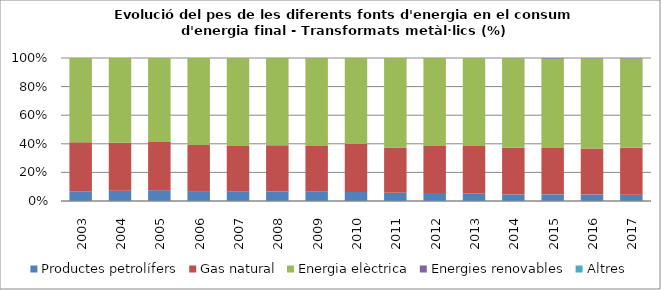
| Category | Productes petrolífers | Gas natural | Energia elèctrica | Energies renovables | Altres |
|---|---|---|---|---|---|
| 2003.0 | 27.7 | 139.5 | 239.2 | 0 | 0 |
| 2004.0 | 29.8 | 138.4 | 244.9 | 0.1 | 0 |
| 2005.0 | 31.3 | 139.2 | 243 | 0.1 | 0 |
| 2006.0 | 27.6 | 129.2 | 243.6 | 0.1 | 0 |
| 2007.0 | 26.7 | 124 | 240.8 | 0.1 | 0 |
| 2008.0 | 24.9 | 121 | 228.7 | 0.2 | 0 |
| 2009.0 | 20.3 | 95.6 | 185.6 | 0.2 | 0 |
| 2010.0 | 20.3 | 106.6 | 191.7 | 0.2 | 0 |
| 2011.0 | 17.7 | 99 | 194.7 | 0.1 | 0 |
| 2012.0 | 16.9 | 99.4 | 185.8 | 0.2 | 0 |
| 2013.0 | 15.7 | 99.1 | 183.3 | 0.3 | 0 |
| 2014.0 | 13.7 | 95.6 | 184.5 | 0.4 | 0 |
| 2015.0 | 14 | 97.9 | 188.6 | 1.1 | 0 |
| 2016.0 | 13.4 | 96 | 188.2 | 0.8 | 0 |
| 2017.0 | 13.7 | 101 | 192.6 | 0.9 | 0 |